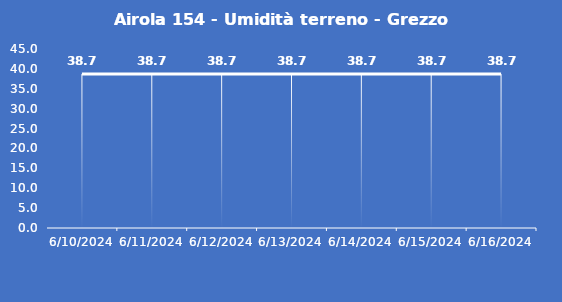
| Category | Airola 154 - Umidità terreno - Grezzo (%VWC) |
|---|---|
| 6/10/24 | 38.7 |
| 6/11/24 | 38.7 |
| 6/12/24 | 38.7 |
| 6/13/24 | 38.7 |
| 6/14/24 | 38.7 |
| 6/15/24 | 38.7 |
| 6/16/24 | 38.7 |